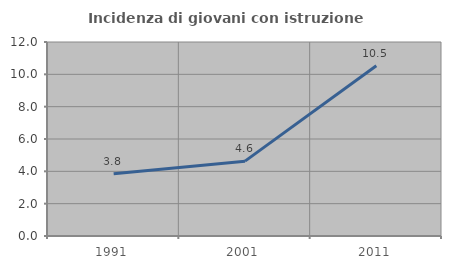
| Category | Incidenza di giovani con istruzione universitaria |
|---|---|
| 1991.0 | 3.846 |
| 2001.0 | 4.63 |
| 2011.0 | 10.526 |